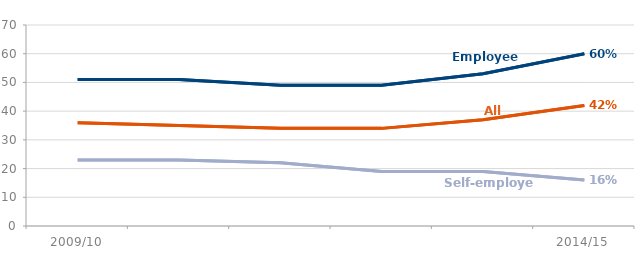
| Category | Employees | Self-employed | Series 5 | Series 2 |
|---|---|---|---|---|
| 2009/10 | 51 | 23 | 36 | 36 |
| 2010/11 | 51 | 23 | 35 | 35 |
| 2011/12 | 49 | 22 | 34 | 34 |
| 2012/13 | 49 | 19 | 34 | 34 |
| 2013/14 | 53 | 19 | 37 | 37 |
| 2014/15 | 60 | 16 | 42 | 42 |